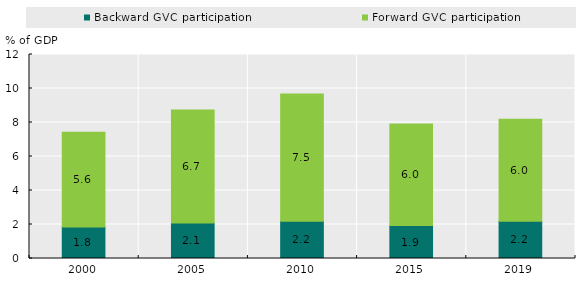
| Category | Backward GVC participation | Forward GVC participation |
|---|---|---|
| 2000.0 | 1.848 | 5.575 |
| 2005.0 | 2.083 | 6.652 |
| 2010.0 | 2.194 | 7.477 |
| 2015.0 | 1.937 | 5.976 |
| 2019.0 | 2.185 | 6.001 |